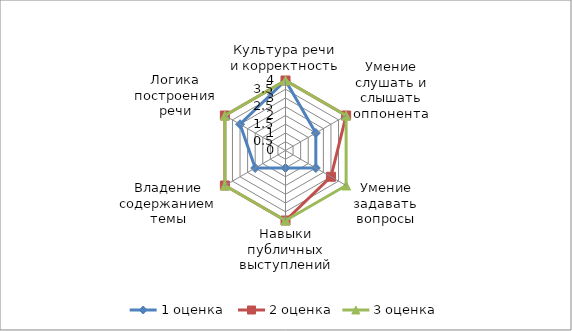
| Category | 1 оценка  | 2 оценка | 3 оценка |
|---|---|---|---|
| Культура речи и корректность | 4 | 4 | 4 |
| Умение слушать и слышать оппонента | 2 | 4 | 4 |
| Умение задавать вопросы | 2 | 3 | 4 |
| Навыки публичных выступлений | 1 | 4 | 4 |
| Владение содержанием темы | 2 | 4 | 4 |
| Логика построения речи | 3 | 4 | 4 |